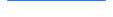
| Category | Series 0 |
|---|---|
| 0 | 79 |
| 1 | 75 |
| 2 | 79 |
| 3 | 88 |
| 4 | 60 |
| 5 | 48 |
| 6 | 57 |
| 7 | 60 |
| 8 | 58 |